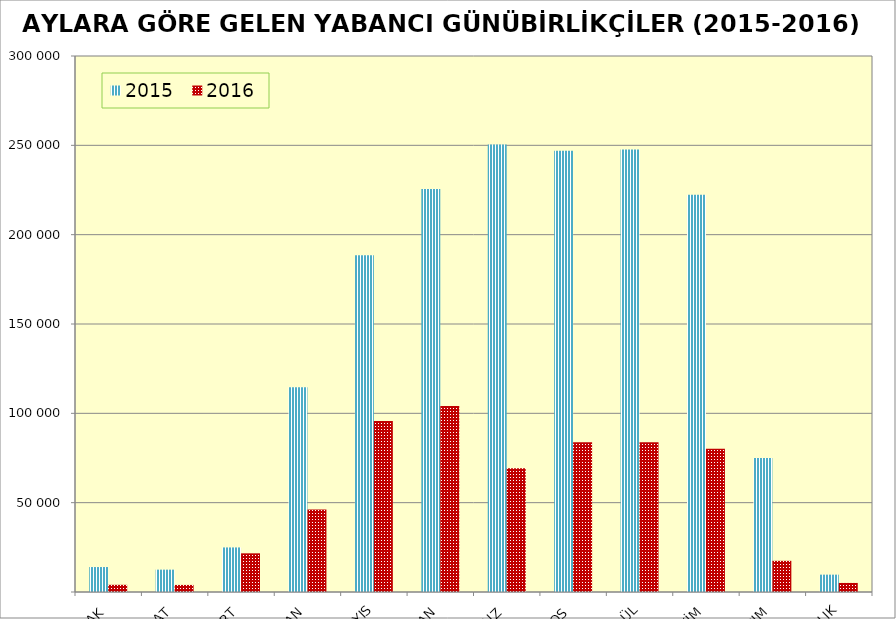
| Category | 2015 | 2016 |
|---|---|---|
| OCAK | 13972 | 4025 |
| ŞUBAT | 12514 | 3958 |
| MART | 24947 | 21650 |
| NİSAN | 114667 | 46238 |
| MAYIS | 188486 | 95724 |
| HAZİRAN | 225570 | 104038 |
| TEMMUZ | 250525 | 69331 |
| AĞUSTOS | 247028 | 83865 |
| EYLÜL | 247642 | 83882 |
| EKİM | 222348 | 80238 |
| KASIM | 75033 | 17454 |
| ARALIK | 9713 | 5074 |